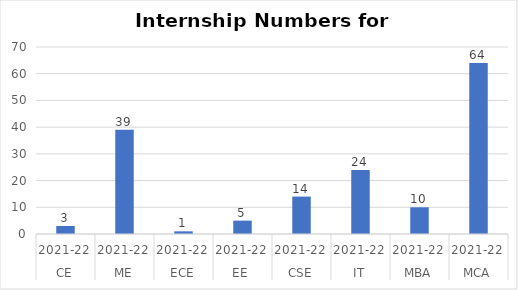
| Category | Internship Numbers |
|---|---|
| 0 | 3 |
| 1 | 39 |
| 2 | 1 |
| 3 | 5 |
| 4 | 14 |
| 5 | 24 |
| 6 | 10 |
| 7 | 64 |